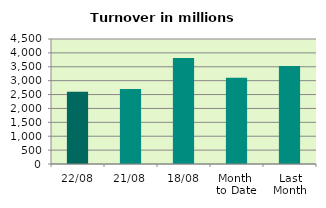
| Category | Series 0 |
|---|---|
| 22/08 | 2605.309 |
| 21/08 | 2701.396 |
| 18/08 | 3813.046 |
| Month 
to Date | 3107.525 |
| Last
Month | 3531.02 |